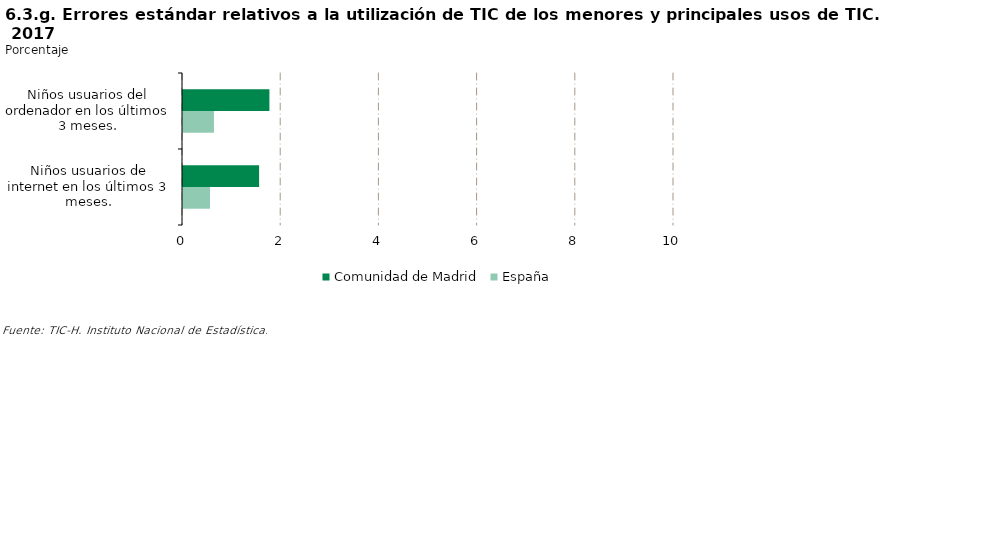
| Category | Comunidad de Madrid | España |
|---|---|---|
| Niños usuarios del ordenador en los últimos 3 meses. | 1.76 | 0.63 |
| Niños usuarios de internet en los últimos 3 meses. | 1.55 | 0.55 |